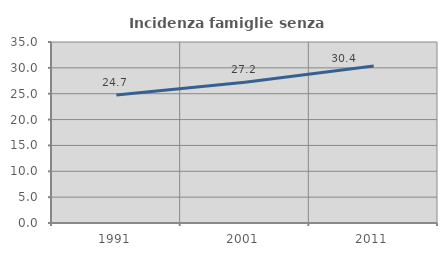
| Category | Incidenza famiglie senza nuclei |
|---|---|
| 1991.0 | 24.742 |
| 2001.0 | 27.208 |
| 2011.0 | 30.37 |